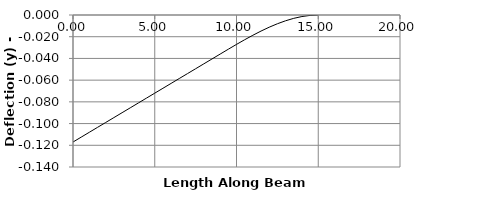
| Category | y |
|---|---|
| 0.0 | -0.117 |
| 0.5 | -0.112 |
| 1.0 | -0.108 |
| 1.5 | -0.104 |
| 2.0 | -0.099 |
| 2.5 | -0.094 |
| 3.0 | -0.09 |
| 3.5 | -0.085 |
| 4.0 | -0.081 |
| 4.5 | -0.076 |
| 5.0 | -0.072 |
| 5.5 | -0.068 |
| 6.0 | -0.063 |
| 6.5 | -0.058 |
| 7.0 | -0.054 |
| 7.5 | -0.05 |
| 8.0 | -0.045 |
| 8.5 | -0.04 |
| 9.0 | -0.036 |
| 9.00001 | -0.036 |
| 9.5 | -0.032 |
| 10.0 | -0.027 |
| 10.5 | -0.023 |
| 11.0 | -0.019 |
| 11.5 | -0.015 |
| 12.0 | -0.011 |
| 12.5 | -0.008 |
| 13.0 | -0.005 |
| 13.5 | -0.003 |
| 14.0 | -0.001 |
| 14.5 | 0 |
| 15.0 | 0 |